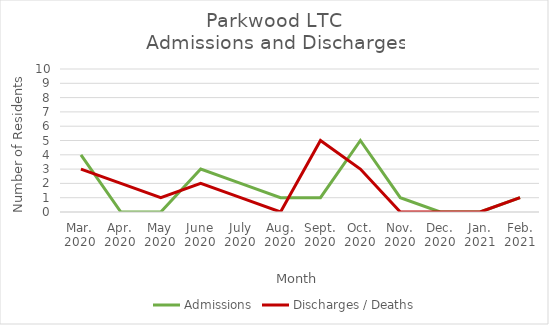
| Category | Admissions | Discharges / Deaths |
|---|---|---|
| Mar.
2020 | 4 | 3 |
| Apr.
2020 | 0 | 2 |
| May
2020 | 0 | 1 |
| June
2020 | 3 | 2 |
| July
2020 | 2 | 1 |
| Aug.
2020 | 1 | 0 |
| Sept.
2020 | 1 | 5 |
| Oct.
2020 | 5 | 3 |
| Nov.
2020 | 1 | 0 |
| Dec.
2020 | 0 | 0 |
| Jan.
2021 | 0 | 0 |
| Feb.
2021 | 1 | 1 |